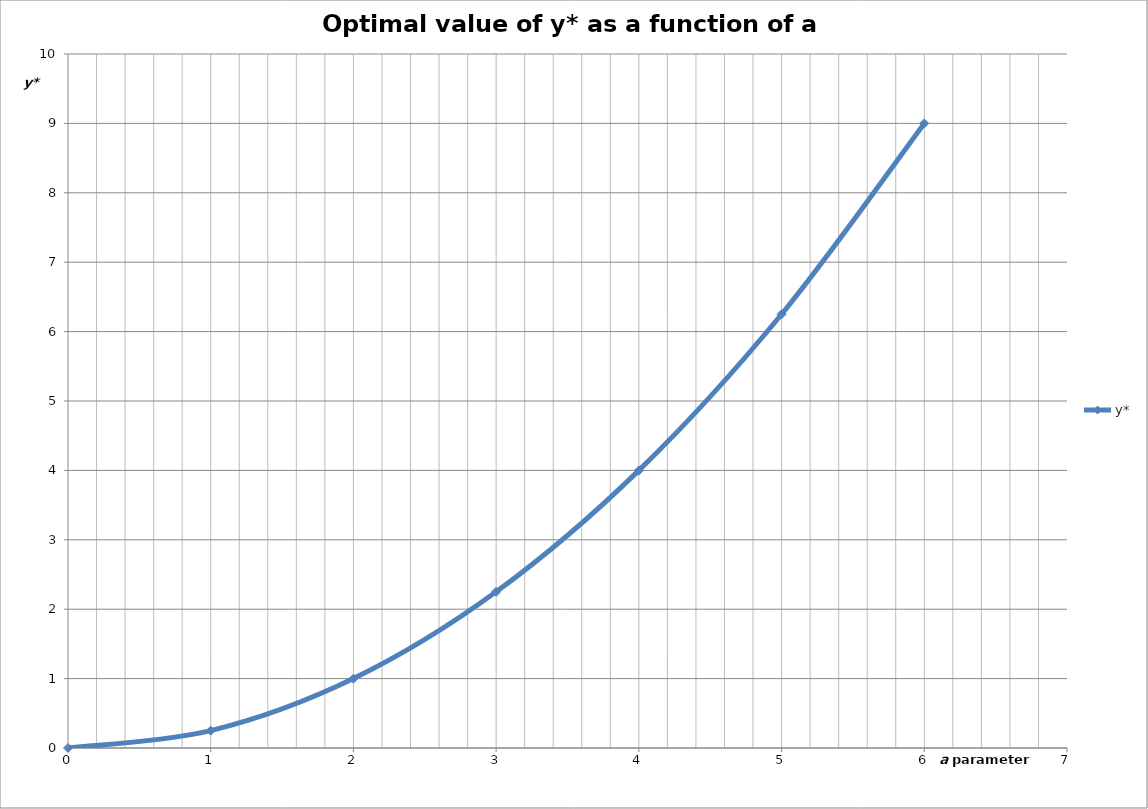
| Category | y* |
|---|---|
| 0.0 | 0 |
| 1.0 | 0.25 |
| 2.0 | 1 |
| 3.0 | 2.25 |
| 4.0 | 4 |
| 5.0 | 6.25 |
| 6.0 | 9 |